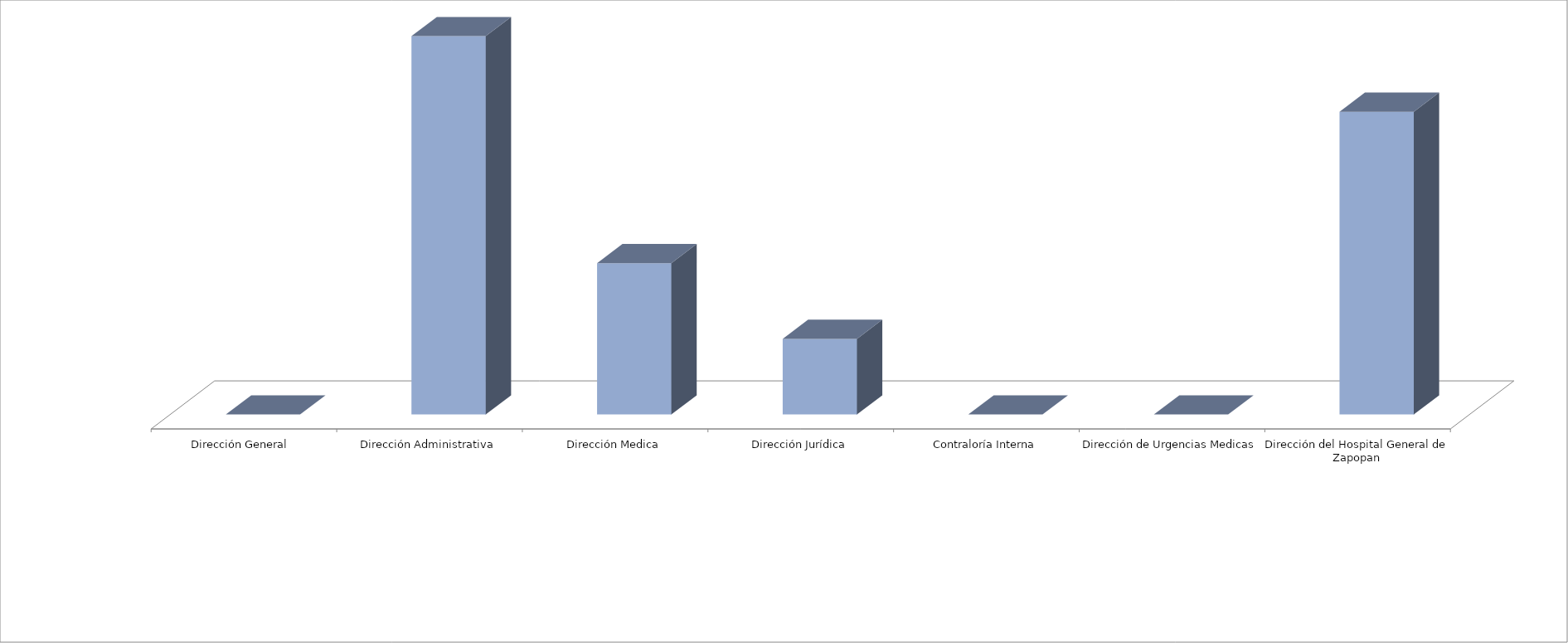
| Category | Series 0 | Series 1 |
|---|---|---|
| Dirección General  |  | 0 |
| Dirección Administrativa |  | 10 |
| Dirección Medica |  | 4 |
| Dirección Jurídica |  | 2 |
| Contraloría Interna |  | 0 |
| Dirección de Urgencias Medicas |  | 0 |
| Dirección del Hospital General de Zapopan |  | 8 |